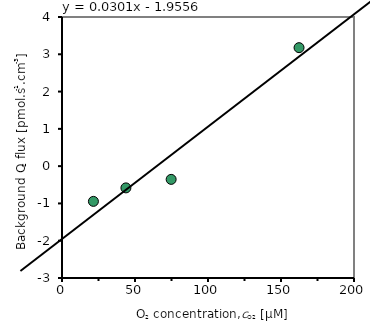
| Category | Series 0 |
|---|---|
| 162.3552 | 3.178 |
| 74.7604 | -0.355 |
| 43.7793 | -0.583 |
| 21.5154 | -0.945 |